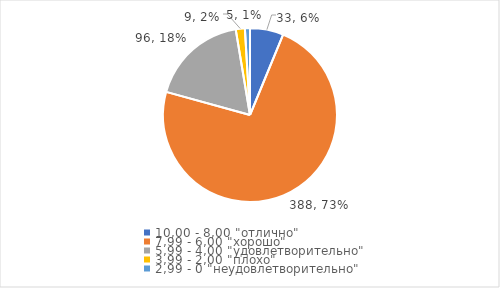
| Category | Series 0 | Series 1 |
|---|---|---|
| 10,00 - 8,00 "отлично" | 33 | 0.062 |
| 7,99 - 6,00 "хорошо" | 388 | 0.731 |
| 5,99 - 4,00 "удовлетворительно" | 96 | 0.181 |
| 3,99 - 2,00 "плохо" | 9 | 0.017 |
| 2,99 - 0 "неудовлетворительно" | 5 | 0.009 |